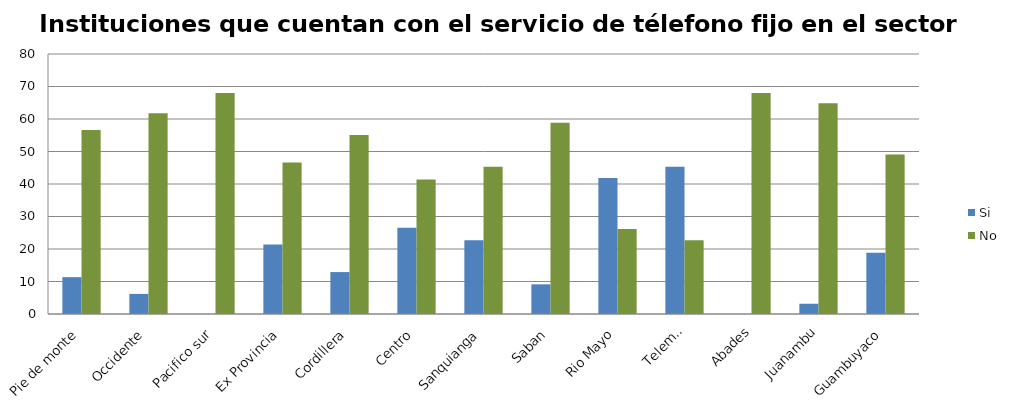
| Category | Si | No |
|---|---|---|
| Pie de monte | 11.33 | 56.65 |
| Occidente | 6.18 | 61.8 |
| Pacifico sur | 0 | 67.98 |
| Ex Provincia | 21.357 | 46.623 |
| Cordillera | 12.902 | 55.078 |
| Centro | 26.572 | 41.408 |
| Sanquianga | 22.66 | 45.32 |
| Saban | 9.128 | 58.852 |
| Rio Mayo | 41.834 | 26.146 |
| Telembi | 45.32 | 22.66 |
| Abades | 0 | 67.98 |
| Juanambu | 3.153 | 64.827 |
| Guambuyaco | 18.883 | 49.097 |